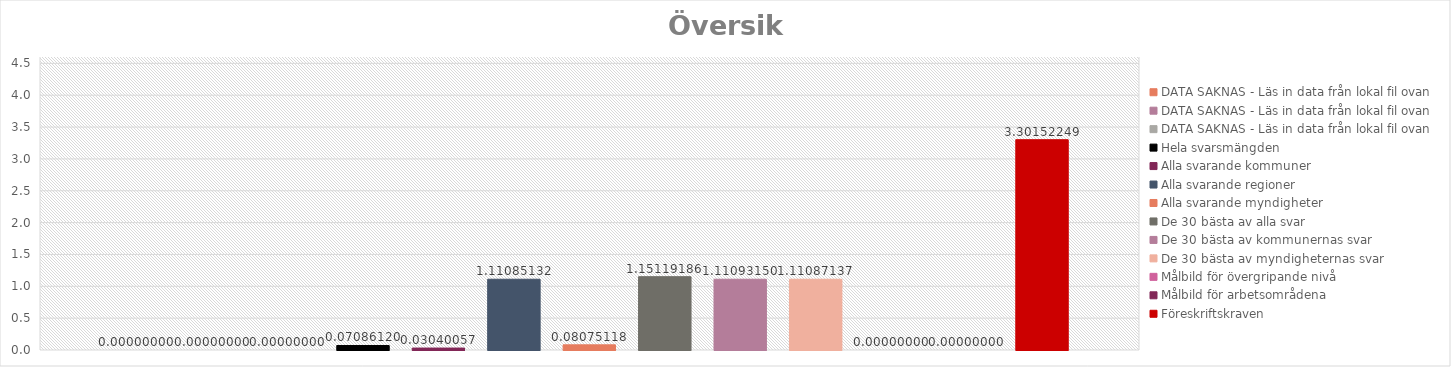
| Category | DATA SAKNAS - Läs in data från lokal fil ovan | Hela svarsmängden | Alla svarande kommuner | Alla svarande regioner | Alla svarande myndigheter | De 30 bästa av alla svar | De 30 bästa av kommunernas svar | De 30 bästa av myndigheternas svar | Målbild för övergripande nivå | Målbild för arbetsområdena | Föreskriftskraven |
|---|---|---|---|---|---|---|---|---|---|---|---|
| 0 | 0 | 0.071 | 0.03 | 1.111 | 0.081 | 1.151 | 1.111 | 1.111 | 0 | 0 | 3.302 |